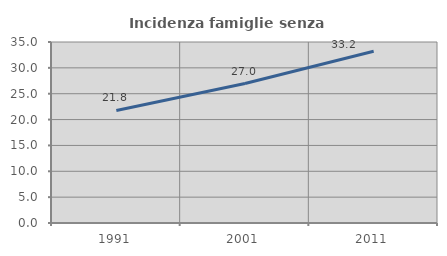
| Category | Incidenza famiglie senza nuclei |
|---|---|
| 1991.0 | 21.767 |
| 2001.0 | 26.973 |
| 2011.0 | 33.203 |